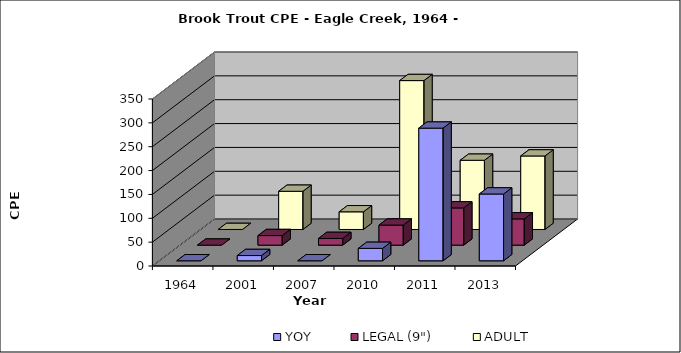
| Category | YOY | LEGAL (9") | ADULT |
|---|---|---|---|
| 1964.0 | 0 | 0 | 0 |
| 2001.0 | 11 | 20 | 80 |
| 2007.0 | 0 | 14 | 37 |
| 2010.0 | 26 | 42 | 312 |
| 2011.0 | 278 | 78 | 145 |
| 2013.0 | 140 | 55 | 154 |